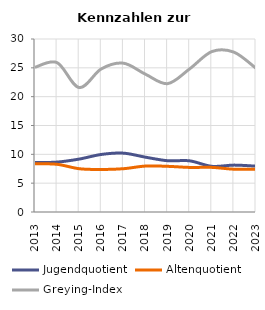
| Category | Jugendquotient | Altenquotient | Greying-Index |
|---|---|---|---|
| 2013.0 | 8.562 | 8.366 | 25.091 |
| 2014.0 | 8.656 | 8.269 | 25.899 |
| 2015.0 | 9.177 | 7.505 | 21.575 |
| 2016.0 | 9.979 | 7.372 | 24.82 |
| 2017.0 | 10.205 | 7.505 | 25.806 |
| 2018.0 | 9.505 | 7.966 | 23.891 |
| 2019.0 | 8.892 | 7.921 | 22.259 |
| 2020.0 | 8.87 | 7.73 | 24.83 |
| 2021.0 | 7.919 | 7.739 | 27.817 |
| 2022.0 | 8.13 | 7.42 | 27.72 |
| 2023.0 | 7.947 | 7.414 | 24.923 |